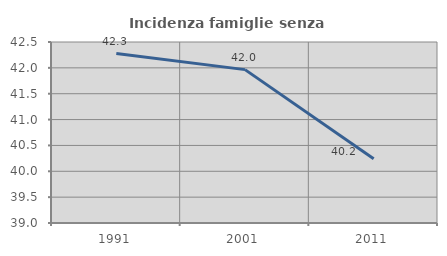
| Category | Incidenza famiglie senza nuclei |
|---|---|
| 1991.0 | 42.276 |
| 2001.0 | 41.966 |
| 2011.0 | 40.244 |